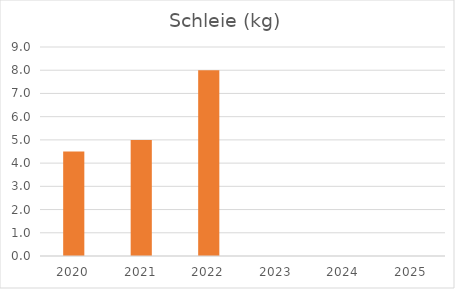
| Category | Schleie (kg) |
|---|---|
| 2020.0 | 4.5 |
| 2021.0 | 5 |
| 2022.0 | 8 |
| 2023.0 | 0 |
| 2024.0 | 0 |
| 2025.0 | 0 |